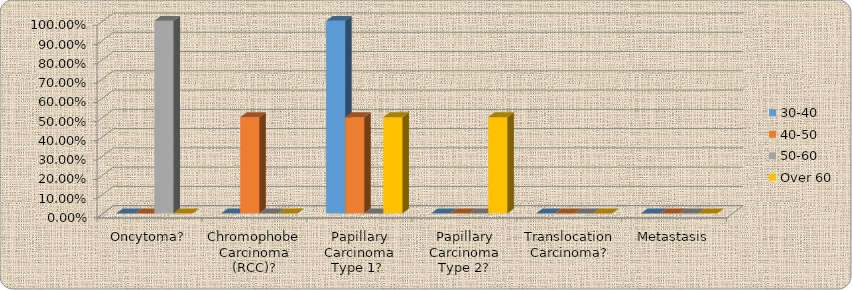
| Category | 30-40 | 40-50 | 50-60 | Over 60 |
|---|---|---|---|---|
| Oncytoma? | 0 | 0 | 1 | 0 |
| Chromophobe Carcinoma (RCC)? | 0 | 0.5 | 0 | 0 |
| Papillary Carcinoma Type 1?  | 1 | 0.5 | 0 | 0.5 |
| Papillary Carcinoma Type 2? | 0 | 0 | 0 | 0.5 |
| Translocation Carcinoma? | 0 | 0 | 0 | 0 |
| Metastasis | 0 | 0 | 0 | 0 |